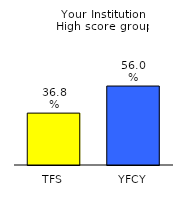
| Category | Series 0 |
|---|---|
| TFS | 0.368 |
| YFCY | 0.56 |